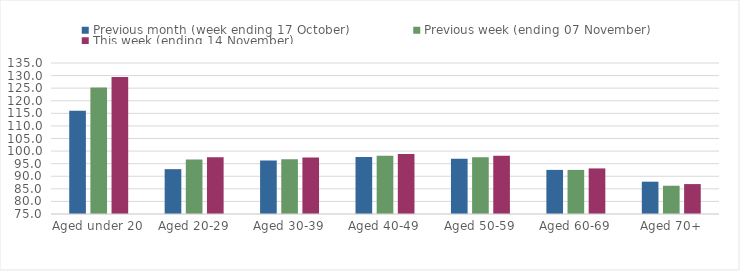
| Category | Previous month (week ending 17 October) | Previous week (ending 07 November) | This week (ending 14 November) |
|---|---|---|---|
| Aged under 20 | 116.03 | 125.28 | 129.47 |
| Aged 20-29 | 92.82 | 96.68 | 97.54 |
| Aged 30-39 | 96.25 | 96.79 | 97.44 |
| Aged 40-49 | 97.65 | 98.16 | 98.87 |
| Aged 50-59 | 96.94 | 97.56 | 98.16 |
| Aged 60-69 | 92.53 | 92.52 | 93.11 |
| Aged 70+ | 87.84 | 86.23 | 86.89 |